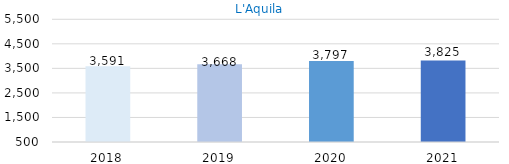
| Category | L'Aquila |
|---|---|
| 2018.0 | 3591 |
| 2019.0 | 3668 |
| 2020.0 | 3797 |
| 2021.0 | 3825 |